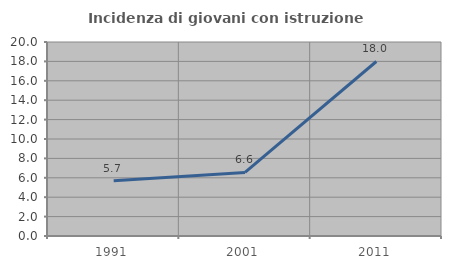
| Category | Incidenza di giovani con istruzione universitaria |
|---|---|
| 1991.0 | 5.697 |
| 2001.0 | 6.554 |
| 2011.0 | 17.992 |